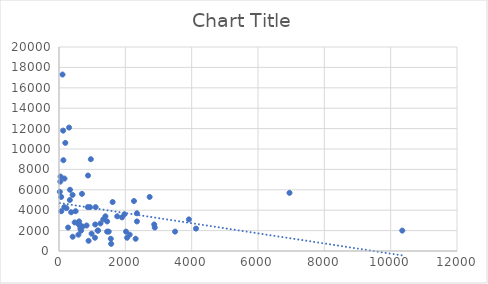
| Category | Series 0 |
|---|---|
| 10350.0 | 2000 |
| 6950.0 | 5700 |
| 2131.0 | 1600 |
| 2871.0 | 2600 |
| 2887.0 | 2300 |
| 1900.0 | 3300 |
| 2260.0 | 4900 |
| 2350.0 | 2900 |
| 1335.0 | 3100 |
| 1400.0 | 3400 |
| 3917.0 | 3100 |
| 502.0 | 3900 |
| 1165.0 | 2000 |
| 867.0 | 4300 |
| 596.0 | 2600 |
| 693.0 | 5600 |
| 1250.0 | 2700 |
| 1573.0 | 700 |
| 1085.0 | 1300 |
| 1091.0 | 2600 |
| 935.0 | 4300 |
| 832.0 | 2500 |
| 472.0 | 2800 |
| 2350.0 | 3700 |
| 2053.0 | 1300 |
| 4131.0 | 2200 |
| 160.0 | 4300 |
| 665.0 | 2000 |
| 1755.0 | 3400 |
| 46.0 | 7300 |
| 713.0 | 2400 |
| 1453.0 | 2900 |
| 1105.0 | 4300 |
| 1500.0 | 1900 |
| 614.0 | 2600 |
| 1975.0 | 3600 |
| 275.0 | 2300 |
| 586.0 | 1600 |
| 2020.0 | 1900 |
| 226.0 | 4200 |
| 3500.0 | 1900 |
| 2310.0 | 1200 |
| 1617.0 | 4800 |
| 892.0 | 1000 |
| 39.0 | 6800 |
| 2733.0 | 5300 |
| 190.0 | 10600 |
| 1562.0 | 1200 |
| 304.0 | 12100 |
| 327.0 | 5000 |
| 66.0 | 5300 |
| 983.0 | 1700 |
| 413.0 | 1400 |
| 332.0 | 6000 |
| 960.0 | 9000 |
| 165.0 | 7100 |
| 606.0 | 2900 |
| 366.0 | 3800 |
| 70.0 | 3900 |
| 125.0 | 11800 |
| 25.0 | 5800 |
| 105.0 | 17300 |
| 409.0 | 5500 |
| 644.0 | 2200 |
| 132.0 | 8900 |
| 1179.0 | 2000 |
| 610.0 | 2600 |
| 875.0 | 7400 |
| 1450.0 | 1900 |